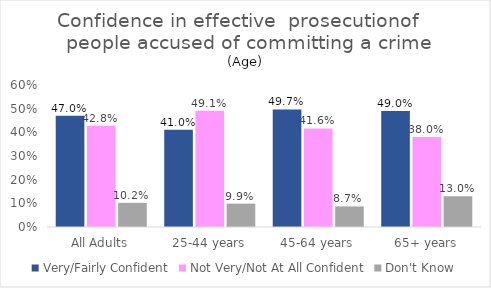
| Category | Very/Fairly Confident | Not Very/Not At All Confident | Don't Know |
|---|---|---|---|
| All Adults | 0.47 | 0.428 | 0.102 |
| 25-44 years | 0.41 | 0.491 | 0.099 |
| 45-64 years | 0.497 | 0.416 | 0.087 |
| 65+ years | 0.49 | 0.38 | 0.13 |